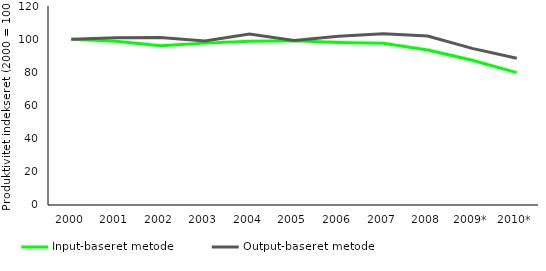
| Category | Input-baseret metode | Output-baseret metode |
|---|---|---|
| 2000 | 100 | 100 |
| 2001 | 98.71 | 100.848 |
| 2002 | 95.969 | 101.015 |
| 2003 | 97.611 | 98.879 |
| 2004 | 98.767 | 103.101 |
| 2005 | 98.998 | 99.142 |
| 2006 | 98.038 | 101.735 |
| 2007 | 97.562 | 103.231 |
| 2008 | 93.508 | 101.905 |
| 2009* | 87.243 | 94.457 |
| 2010* | 79.816 | 88.468 |